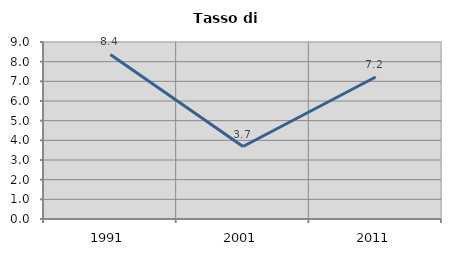
| Category | Tasso di disoccupazione   |
|---|---|
| 1991.0 | 8.368 |
| 2001.0 | 3.686 |
| 2011.0 | 7.219 |